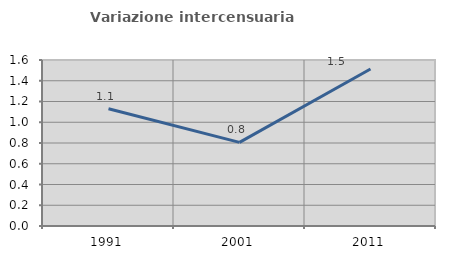
| Category | Variazione intercensuaria annua |
|---|---|
| 1991.0 | 1.13 |
| 2001.0 | 0.806 |
| 2011.0 | 1.514 |